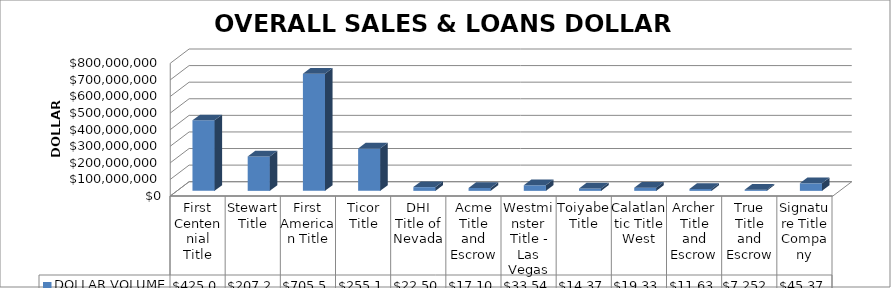
| Category | DOLLAR VOLUME |
|---|---|
| First Centennial Title | 425086747.19 |
| Stewart Title | 207267208.04 |
| First American Title | 705520083.83 |
| Ticor Title | 255106280 |
| DHI Title of Nevada | 22507290 |
| Acme Title and Escrow | 17106250 |
| Westminster Title - Las Vegas | 33548817 |
| Toiyabe Title | 14374145 |
| Calatlantic Title West | 19335642 |
| Archer Title and Escrow | 11637587 |
| True Title and Escrow | 7252800 |
| Signature Title Company | 45375300 |